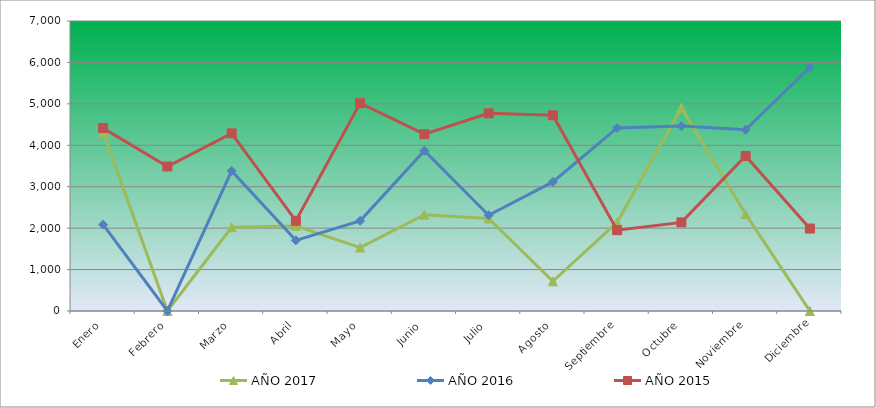
| Category | AÑO 2017 | AÑO 2016 | AÑO 2015 |
|---|---|---|---|
| Enero | 4318.776 | 2084.91 | 4414.752 |
| Febrero | 0 | 0 | 3488.812 |
| Marzo | 2020.779 | 3380.069 | 4288.334 |
| Abril | 2053.817 | 1705.321 | 2177.063 |
| Mayo | 1530.727 | 2175.559 | 5017.271 |
| Junio | 2323.621 | 3869.548 | 4267.867 |
| Julio | 2235.522 | 2311.531 | 4770.863 |
| Agosto | 716.978 | 3115.406 | 4724.855 |
| Septiembre | 2141.916 | 4418.475 | 1951.089 |
| Octubre | 4906.778 | 4462.848 | 2138.482 |
| Noviembre | 2337.237 | 4375.328 | 3741.834 |
| Diciembre | 0 | 5883.551 | 1989.67 |